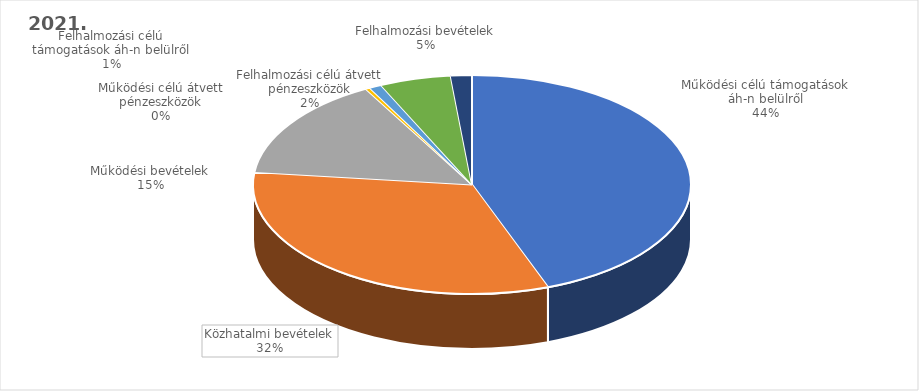
| Category | 2021. év |
|---|---|
| Működési célú támogatások áh-n belülről | 15465205000 |
| Közhatalmi bevételek | 11318219000 |
| Működési bevételek | 5261733000 |
| Működési célú átvett pénzeszközök | 118532000 |
| Felhalmozási célú támogatások áh-n belülről | 313931000 |
| Felhalmozási bevételek | 1838999000 |
| Felhalmozási célú átvett pénzeszközök | 542370000 |